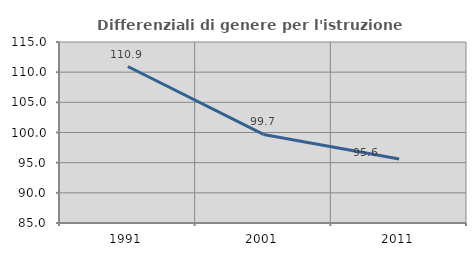
| Category | Differenziali di genere per l'istruzione superiore |
|---|---|
| 1991.0 | 110.935 |
| 2001.0 | 99.675 |
| 2011.0 | 95.596 |